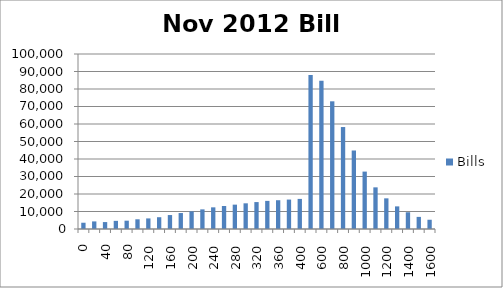
| Category | Bills |
|---|---|
| 0.0 | 3582.43 |
| 20.0 | 4336.055 |
| 40.0 | 3960.917 |
| 60.0 | 4652.603 |
| 80.0 | 4754.346 |
| 100.0 | 5551.993 |
| 120.0 | 6049.066 |
| 140.0 | 6735.474 |
| 160.0 | 7969.365 |
| 180.0 | 9124.048 |
| 200.0 | 10075.048 |
| 220.0 | 11218.563 |
| 240.0 | 12377.88 |
| 260.0 | 13140.553 |
| 280.0 | 13918.829 |
| 300.0 | 14677.42 |
| 320.0 | 15387.664 |
| 340.0 | 16067.987 |
| 360.0 | 16447.863 |
| 380.0 | 16813.691 |
| 400.0 | 17197.519 |
| 500.0 | 88037.216 |
| 600.0 | 84746.75 |
| 700.0 | 72964.553 |
| 800.0 | 58263.711 |
| 900.0 | 44861.133 |
| 1000.0 | 32800.211 |
| 1100.0 | 23800.006 |
| 1200.0 | 17517.29 |
| 1300.0 | 12925.525 |
| 1400.0 | 9578.503 |
| 1500.0 | 6921.409 |
| 1600.0 | 5288.66 |